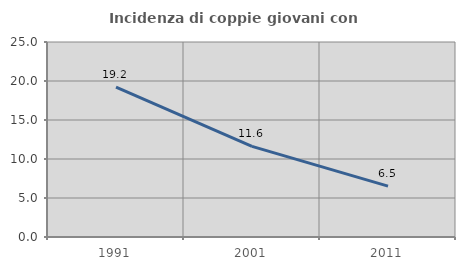
| Category | Incidenza di coppie giovani con figli |
|---|---|
| 1991.0 | 19.214 |
| 2001.0 | 11.614 |
| 2011.0 | 6.526 |